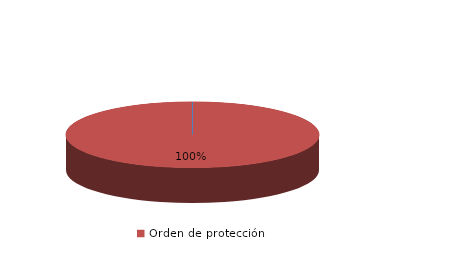
| Category | Series 0 |
|---|---|
| Orden de alejamiento | 0 |
| Orden de protección | 4 |